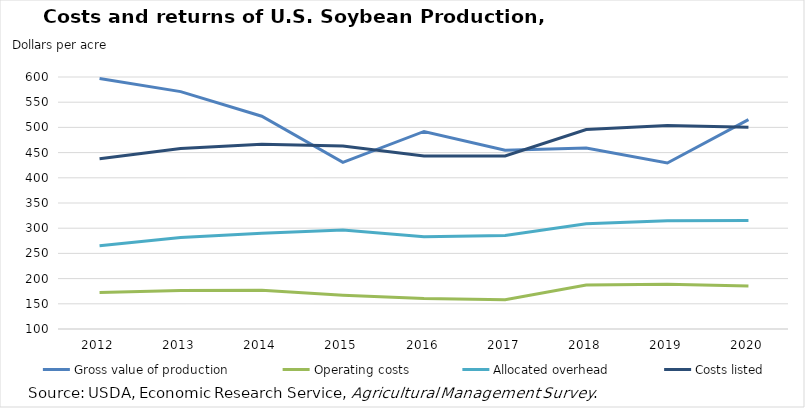
| Category | Gross value of production | Operating costs | Allocated overhead | Costs listed |
|---|---|---|---|---|
| 2012.0 | 596.82 | 172.29 | 265.3 | 437.59 |
| 2013.0 | 571.04 | 176.63 | 281.68 | 458.31 |
| 2014.0 | 522.24 | 176.79 | 289.93 | 466.72 |
| 2015.0 | 430.56 | 166.97 | 296.33 | 463.3 |
| 2016.0 | 491.92 | 160.31 | 283.15 | 443.46 |
| 2017.0 | 454.72 | 158.08 | 285.42 | 443.5 |
| 2018.0 | 458.91 | 187.16 | 308.7 | 495.86 |
| 2019.0 | 429.34 | 188.95 | 314.78 | 503.73 |
| 2020.0 | 515.4 | 185.12 | 315.26 | 500.38 |